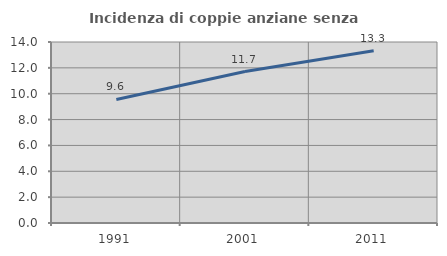
| Category | Incidenza di coppie anziane senza figli  |
|---|---|
| 1991.0 | 9.553 |
| 2001.0 | 11.717 |
| 2011.0 | 13.331 |